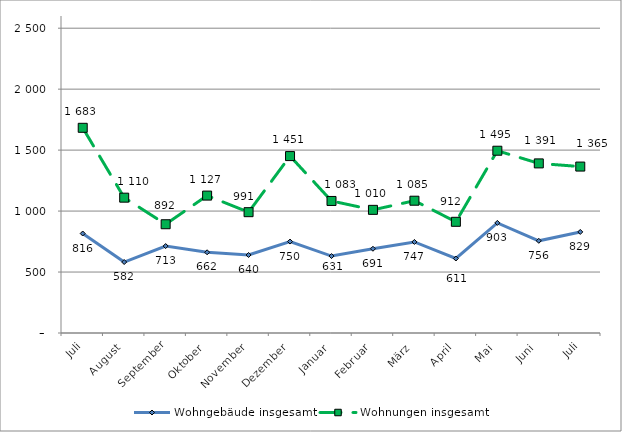
| Category | Wohngebäude insgesamt | Wohnungen insgesamt |
|---|---|---|
| Juli | 816 | 1683 |
| August | 582 | 1110 |
| September | 713 | 892 |
| Oktober | 662 | 1127 |
| November | 640 | 991 |
| Dezember | 750 | 1451 |
| Januar | 631 | 1083 |
| Februar | 691 | 1010 |
| März | 747 | 1085 |
| April | 611 | 912 |
| Mai | 903 | 1495 |
| Juni | 756 | 1391 |
| Juli | 829 | 1365 |